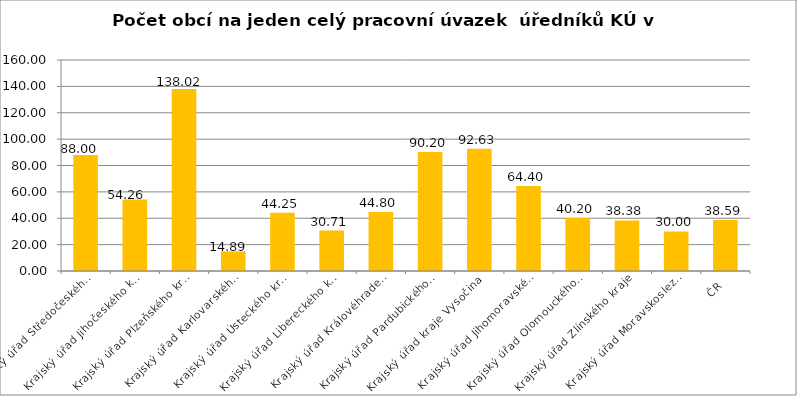
| Category | Počet obcí na jeden celý pracovní úvazek  úředníků KÚ |
|---|---|
| Krajský úřad Středočeského kraje | 88 |
| Krajský úřad Jihočeského kraje | 54.26 |
| Krajský úřad Plzeňského kraje | 138.02 |
| Krajský úřad Karlovarského kraje | 14.89 |
| Krajský úřad Ústeckého kraje | 44.25 |
| Krajský úřad Libereckého kraje | 30.71 |
| Krajský úřad Královéhradeckého kraje | 44.8 |
| Krajský úřad Pardubického kraje | 90.2 |
| Krajský úřad kraje Vysočina | 92.63 |
| Krajský úřad Jihomoravského kraje | 64.4 |
| Krajský úřad Olomouckého kraje | 40.2 |
| Krajský úřad Zlínského kraje | 38.38 |
| Krajský úřad Moravskoslezského kraje | 30 |
| ČR | 38.59 |